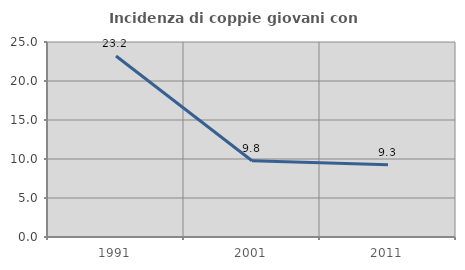
| Category | Incidenza di coppie giovani con figli |
|---|---|
| 1991.0 | 23.207 |
| 2001.0 | 9.774 |
| 2011.0 | 9.278 |